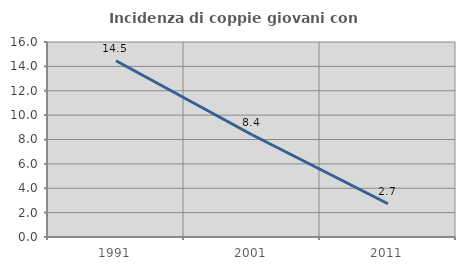
| Category | Incidenza di coppie giovani con figli |
|---|---|
| 1991.0 | 14.458 |
| 2001.0 | 8.392 |
| 2011.0 | 2.727 |